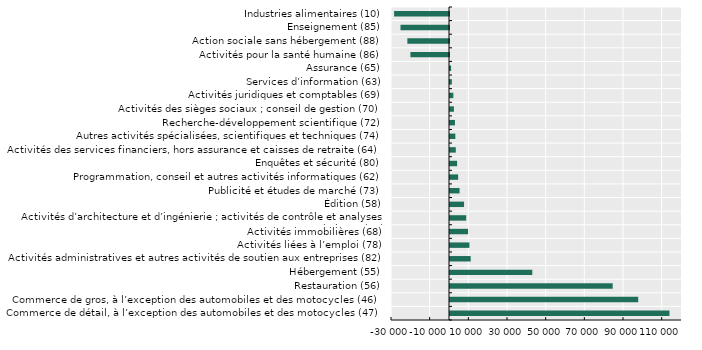
| Category | Series 0 |
|---|---|
| Commerce de détail, à l’exception des automobiles et des motocycles (47) | 113518.051 |
| Commerce de gros, à l’exception des automobiles et des motocycles (46) | 97355.431 |
| Restauration (56) | 84153.32 |
| Hébergement (55) | 42569.096 |
| Activités administratives et autres activités de soutien aux entreprises (82) | 10706.302 |
| Activités liées à l’emploi (78) | 10038.868 |
| Activités immobilières (68) | 9353.627 |
| Activités d’architecture et d’ingénierie ; activités de contrôle et analyses techniques (71) | 8374.814 |
| Édition (58) | 7269.154 |
| Publicité et études de marché (73) | 4952.911 |
| Programmation, conseil et autres activités informatiques (62) | 4211.977 |
| Enquêtes et sécurité (80) | 3679.44 |
| Activités des services financiers, hors assurance et caisses de retraite (64) | 2990.088 |
| Autres activités spécialisées, scientifiques et techniques (74) | 2758.886 |
| Recherche-développement scientifique (72) | 2555.779 |
| Activités des sièges sociaux ; conseil de gestion (70) | 2023.938 |
| Activités juridiques et comptables (69) | 1729.076 |
| Services d’information (63) | 958.509 |
| Assurance (65) | 571.091 |
| Activités pour la santé humaine (86) | -19955.406 |
| Action sociale sans hébergement (88) | -21539.948 |
| Enseignement (85) | -25087.69 |
| Industries alimentaires (10) | -28394.493 |